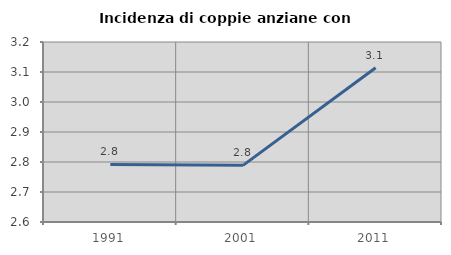
| Category | Incidenza di coppie anziane con figli |
|---|---|
| 1991.0 | 2.792 |
| 2001.0 | 2.789 |
| 2011.0 | 3.114 |